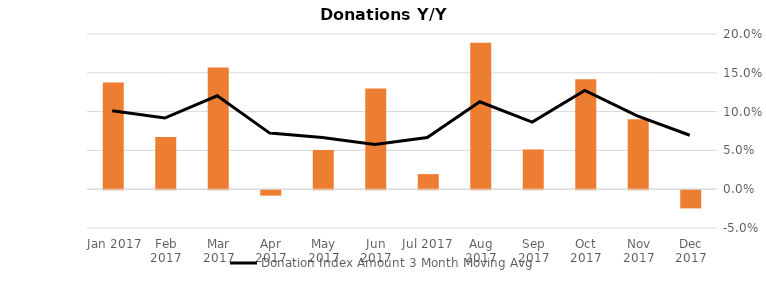
| Category | Donation Index Amount Y/Y Growth |
|---|---|
| Dec 2017 | -0.023 |
| Nov 2017 | 0.09 |
| Oct 2017 | 0.142 |
| Sep 2017 | 0.051 |
| Aug 2017 | 0.189 |
| Jul 2017 | 0.019 |
| Jun 2017 | 0.13 |
| May 2017 | 0.05 |
| Apr 2017 | -0.007 |
| Mar 2017 | 0.157 |
| Feb 2017 | 0.067 |
| Jan 2017 | 0.137 |